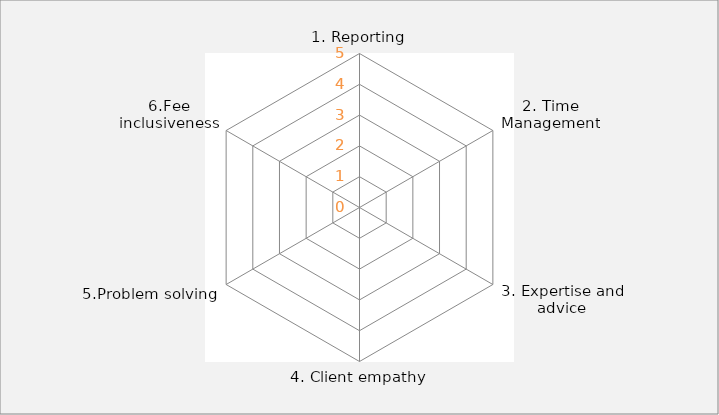
| Category | Series 0 |
|---|---|
| 1. Reporting | 0 |
| 2. Time Management | 0 |
| 3. Expertise and advice | 0 |
| 4. Client empathy | 0 |
| 5.Problem solving | 0 |
| 6.Fee inclusiveness | 0 |